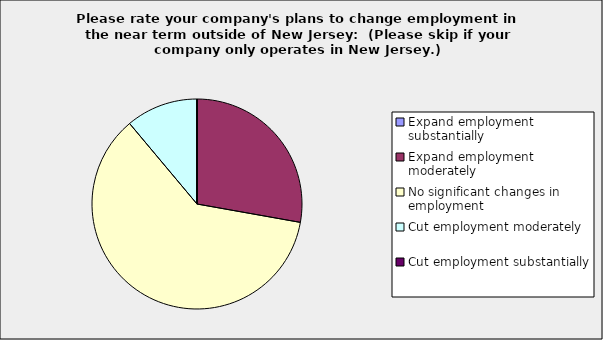
| Category | Series 0 |
|---|---|
| Expand employment substantially | 0 |
| Expand employment moderately | 0.278 |
| No significant changes in employment | 0.611 |
| Cut employment moderately | 0.111 |
| Cut employment substantially | 0 |